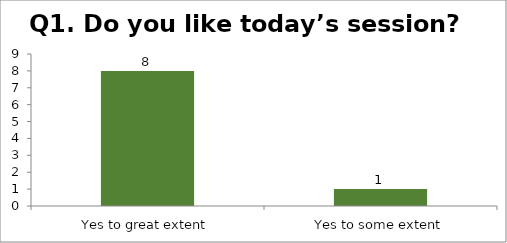
| Category | Q1. Do you like today’s session? |
|---|---|
| Yes to great extent | 8 |
| Yes to some extent | 1 |